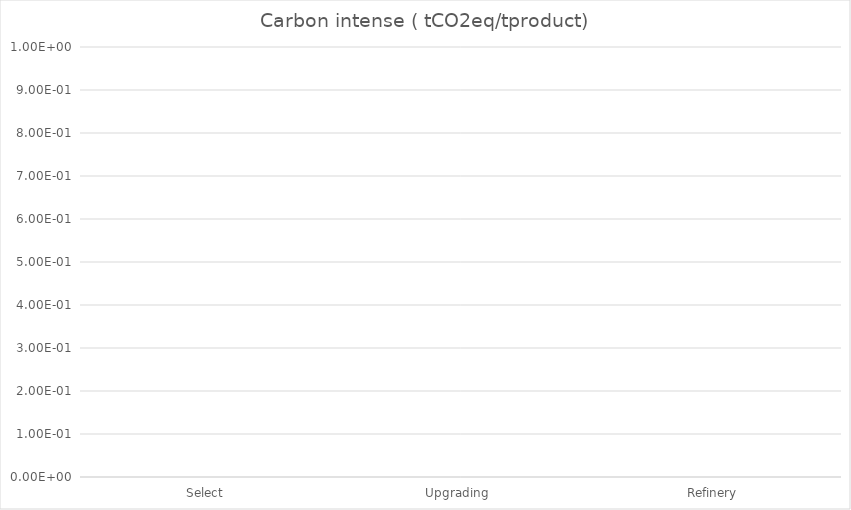
| Category | Series 0 |
|---|---|
| Select | 0 |
| Upgrading  | 0 |
| Refinery | 0 |